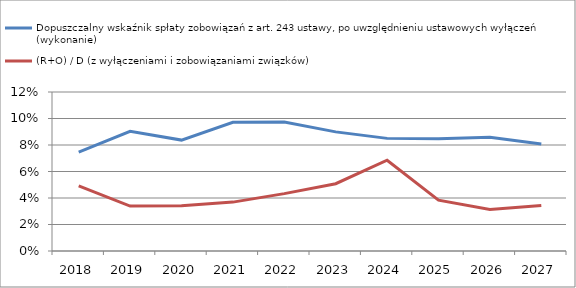
| Category | Dopuszczalny wskaźnik spłaty zobowiązań z art. 243 ustawy, po uwzględnieniu ustawowych wyłączeń (wykonanie)  | (R+O) / D (z wyłączeniami i zobowiązaniami związków) |
|---|---|---|
| 2018.0 | 0.075 | 0.049 |
| 2019.0 | 0.09 | 0.034 |
| 2020.0 | 0.084 | 0.034 |
| 2021.0 | 0.097 | 0.037 |
| 2022.0 | 0.097 | 0.043 |
| 2023.0 | 0.09 | 0.051 |
| 2024.0 | 0.085 | 0.068 |
| 2025.0 | 0.085 | 0.038 |
| 2026.0 | 0.086 | 0.031 |
| 2027.0 | 0.081 | 0.034 |